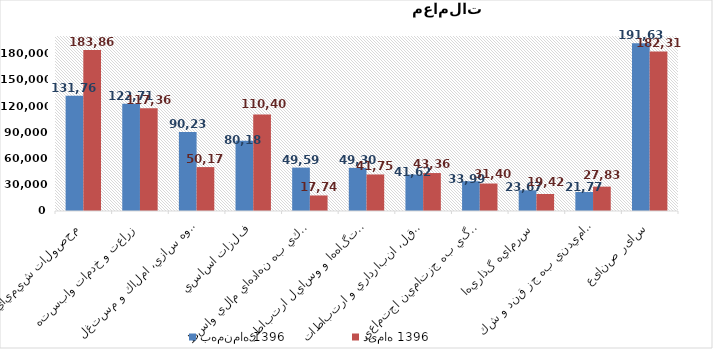
| Category | بهمن‌ماه 1396 | دی‌ماه 1396 |
|---|---|---|
| محصولات شيميايي | 131761 | 183868 |
| زراعت و خدمات وابسته | 122713 | 117369 |
| انبوه سازي، املاك و مستغلات | 90236 | 50174 |
| فلزات اساسي | 80184 | 110401 |
| فعاليتهاي كمكي به نهادهاي مالي واسط | 49591 | 17741 |
| ساخت دستگاه‌ها و وسايل ارتباطي | 49301 | 41750 |
| حمل ونقل، انبارداري و ارتباطات | 41628 | 43369 |
| بيمه وصندوق بازنشستگي به جزتامين اجتماعي | 33995 | 31402 |
| سرمايه گذاريها | 23673 | 19426 |
| محصولات غذايي و آشاميدني به جز قند و شكر | 21771 | 27836 |
| سایر صنایع | 191630 | 182314 |